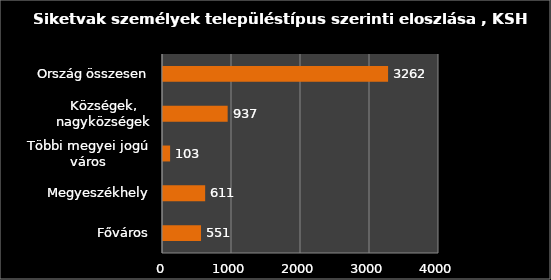
| Category | Series 0 |
|---|---|
| Főváros | 551 |
| Megyeszékhely | 611 |
| Többi megyei jogú város | 103 |
| Községek, nagyközségek | 937 |
| Ország összesen | 3262 |